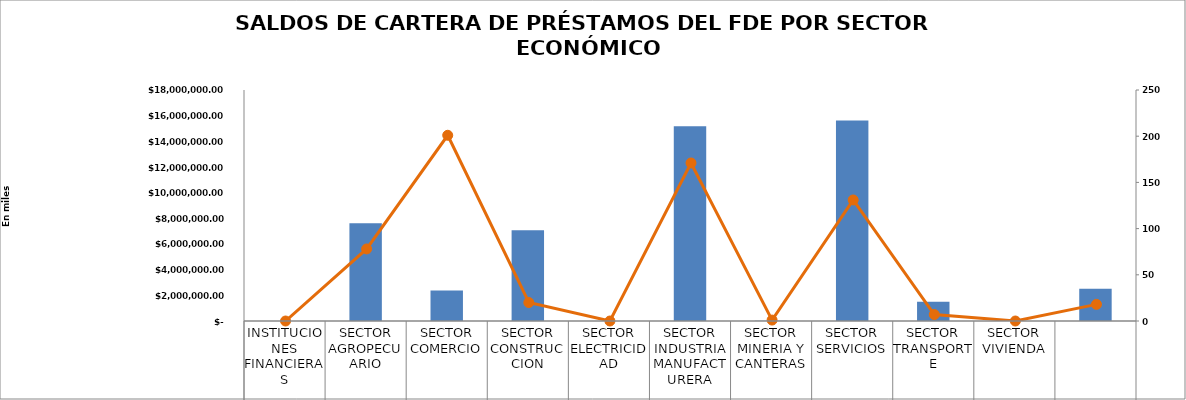
| Category |  Saldo del Crédito en Miles US$ |
|---|---|
| INSTITUCIONES FINANCIERAS | 0 |
| SECTOR AGROPECUARIO | 7626030.7 |
| SECTOR COMERCIO | 2370926.3 |
| SECTOR CONSTRUCCION | 7078732.02 |
| SECTOR ELECTRICIDAD | 0 |
| SECTOR INDUSTRIA MANUFACTURERA | 15174488.42 |
| SECTOR MINERIA Y CANTERAS | 16355.07 |
| SECTOR SERVICIOS | 15626251.46 |
| SECTOR TRANSPORTE | 1501229.44 |
| SECTOR VIVIENDA | 0 |